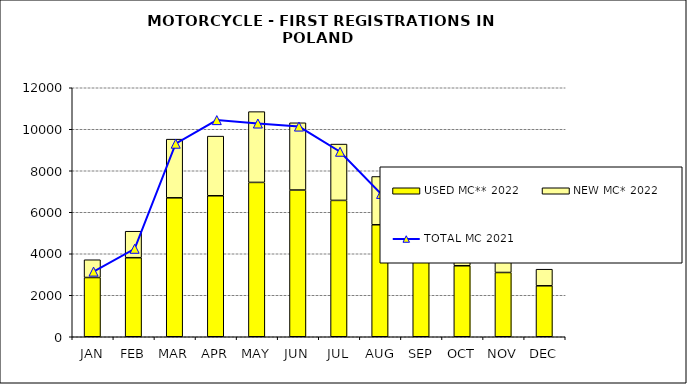
| Category | USED MC** 2022 | NEW MC* 2022 |
|---|---|---|
| JAN | 2855 | 856 |
| FEB | 3810 | 1276 |
| MAR | 6696 | 2828 |
| APR | 6795 | 2875 |
| MAY | 7438 | 3412 |
| JUN | 7071 | 3241 |
| JUL | 6571 | 2715 |
| AUG | 5398 | 2326 |
| SEP | 4265 | 1469 |
| OCT | 3421 | 1176 |
| NOV | 3097 | 936 |
| DEC | 2456 | 800 |